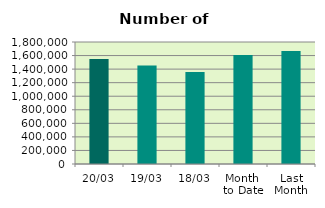
| Category | Series 0 |
|---|---|
| 20/03 | 1547394 |
| 19/03 | 1454226 |
| 18/03 | 1358772 |
| Month 
to Date | 1609079.429 |
| Last
Month | 1666801.1 |